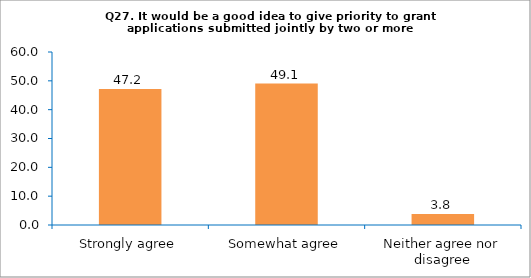
| Category | Series 0 |
|---|---|
| Strongly agree | 47.17 |
| Somewhat agree | 49.057 |
| Neither agree nor disagree | 3.774 |